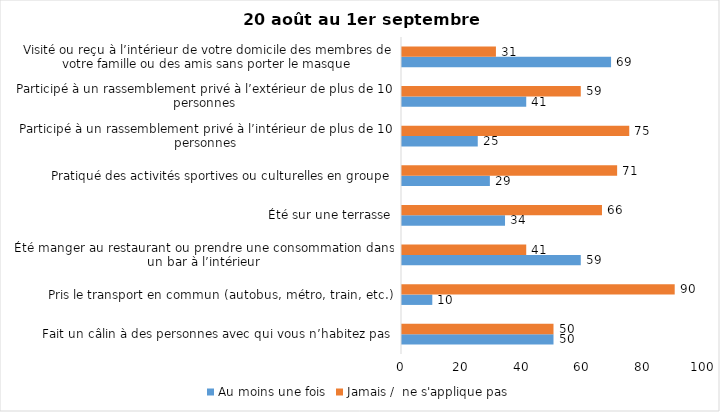
| Category | Au moins une fois | Jamais /  ne s'applique pas |
|---|---|---|
| Fait un câlin à des personnes avec qui vous n’habitez pas | 50 | 50 |
| Pris le transport en commun (autobus, métro, train, etc.) | 10 | 90 |
| Été manger au restaurant ou prendre une consommation dans un bar à l’intérieur | 59 | 41 |
| Été sur une terrasse | 34 | 66 |
| Pratiqué des activités sportives ou culturelles en groupe | 29 | 71 |
| Participé à un rassemblement privé à l’intérieur de plus de 10 personnes | 25 | 75 |
| Participé à un rassemblement privé à l’extérieur de plus de 10 personnes | 41 | 59 |
| Visité ou reçu à l’intérieur de votre domicile des membres de votre famille ou des amis sans porter le masque | 69 | 31 |